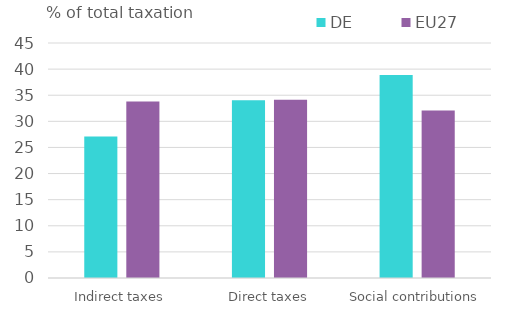
| Category | DE | EU27 |
|---|---|---|
| Indirect taxes | 27.105 | 33.811 |
| Direct taxes | 34.025 | 34.133 |
| Social contributions | 38.869 | 32.056 |